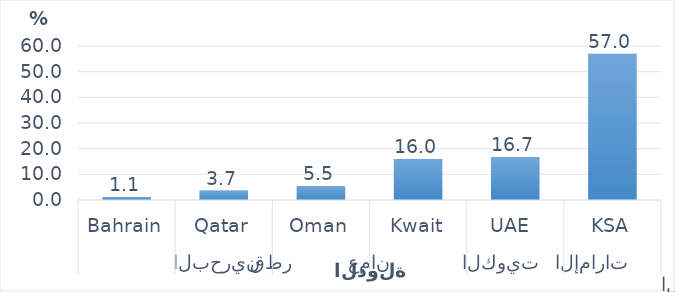
| Category | Series 0 |
|---|---|
| 0 | 57.009 |
| 1 | 16.718 |
| 2 | 15.989 |
| 3 | 5.488 |
| 4 | 3.669 |
| 5 | 1.127 |